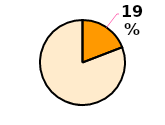
| Category | Series 0 |
|---|---|
| 0 | 0.191 |
| 1 | 0.809 |